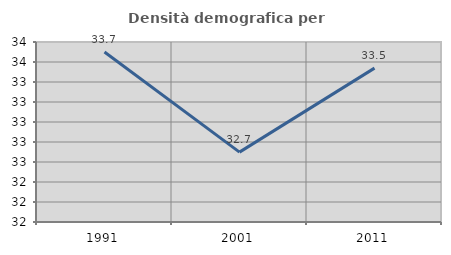
| Category | Densità demografica |
|---|---|
| 1991.0 | 33.7 |
| 2001.0 | 32.699 |
| 2011.0 | 33.539 |